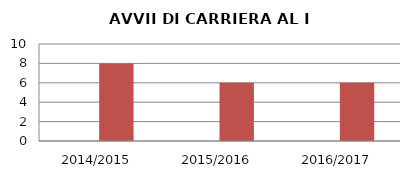
| Category | ANNO | NUMERO |
|---|---|---|
| 2014/2015 | 0 | 8 |
| 2015/2016 | 0 | 6 |
| 2016/2017 | 0 | 6 |